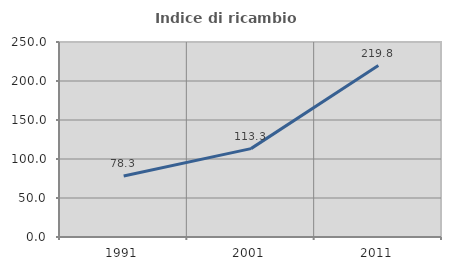
| Category | Indice di ricambio occupazionale  |
|---|---|
| 1991.0 | 78.273 |
| 2001.0 | 113.297 |
| 2011.0 | 219.843 |